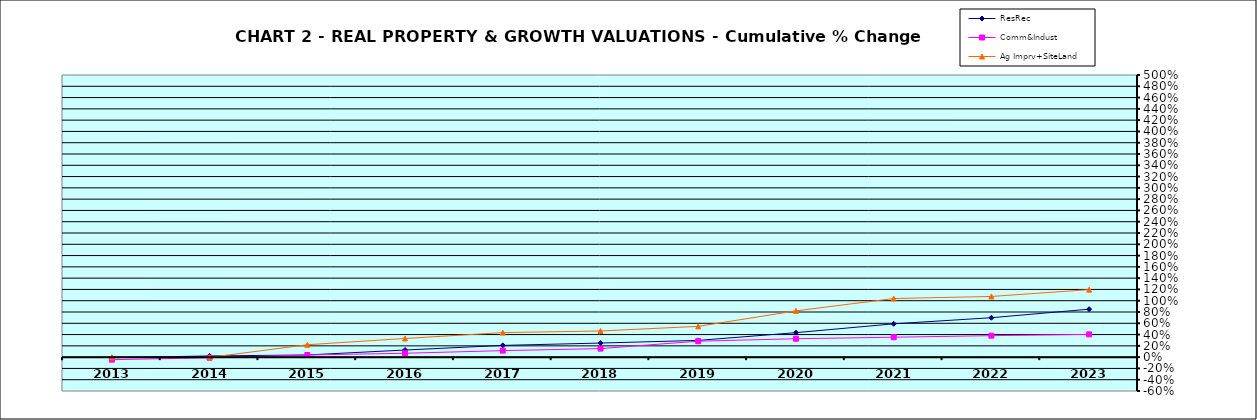
| Category | ResRec | Comm&Indust | Ag Imprv+SiteLand |
|---|---|---|---|
| 2013.0 | -0.009 | -0.045 | 0 |
| 2014.0 | 0.021 | -0.011 | -0.005 |
| 2015.0 | 0.038 | 0.038 | 0.22 |
| 2016.0 | 0.126 | 0.069 | 0.331 |
| 2017.0 | 0.208 | 0.115 | 0.435 |
| 2018.0 | 0.25 | 0.152 | 0.464 |
| 2019.0 | 0.297 | 0.283 | 0.545 |
| 2020.0 | 0.434 | 0.326 | 0.82 |
| 2021.0 | 0.591 | 0.353 | 1.039 |
| 2022.0 | 0.699 | 0.381 | 1.075 |
| 2023.0 | 0.85 | 0.403 | 1.197 |